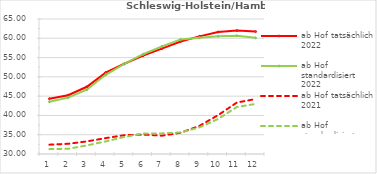
| Category | ab Hof tatsächlich 2022 | ab Hof standardisiert 2022 | ab Hof tatsächlich 2021 | ab Hof standardisiert 2021 |
|---|---|---|---|---|
| 0 | 44.329 | 43.55 | 32.418 | 31.262 |
| 1 | 45.249 | 44.619 | 32.648 | 31.35 |
| 2 | 47.431 | 46.672 | 33.266 | 32.225 |
| 3 | 51.107 | 50.537 | 34.116 | 33.264 |
| 4 | 53.406 | 53.359 | 34.884 | 34.422 |
| 5 | 55.491 | 55.871 | 35.044 | 35.284 |
| 6 | 57.311 | 57.909 | 34.751 | 35.346 |
| 7 | 59.167 | 59.712 | 35.511 | 35.596 |
| 8 | 60.502 | 60.159 | 37.286 | 36.896 |
| 9 | 61.637 | 60.516 | 40.079 | 39.08 |
| 10 | 61.997 | 60.631 | 43.339 | 42.194 |
| 11 | 61.747 | 60.109 | 44.26 | 42.975 |